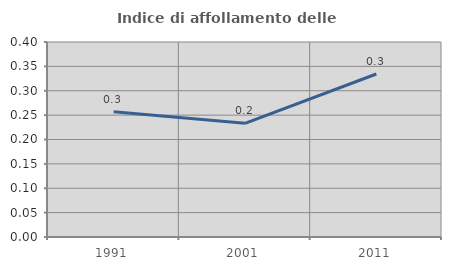
| Category | Indice di affollamento delle abitazioni  |
|---|---|
| 1991.0 | 0.257 |
| 2001.0 | 0.233 |
| 2011.0 | 0.334 |